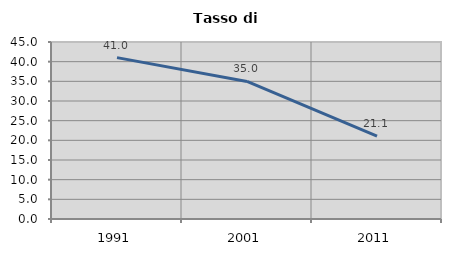
| Category | Tasso di disoccupazione   |
|---|---|
| 1991.0 | 41.031 |
| 2001.0 | 34.966 |
| 2011.0 | 21.085 |